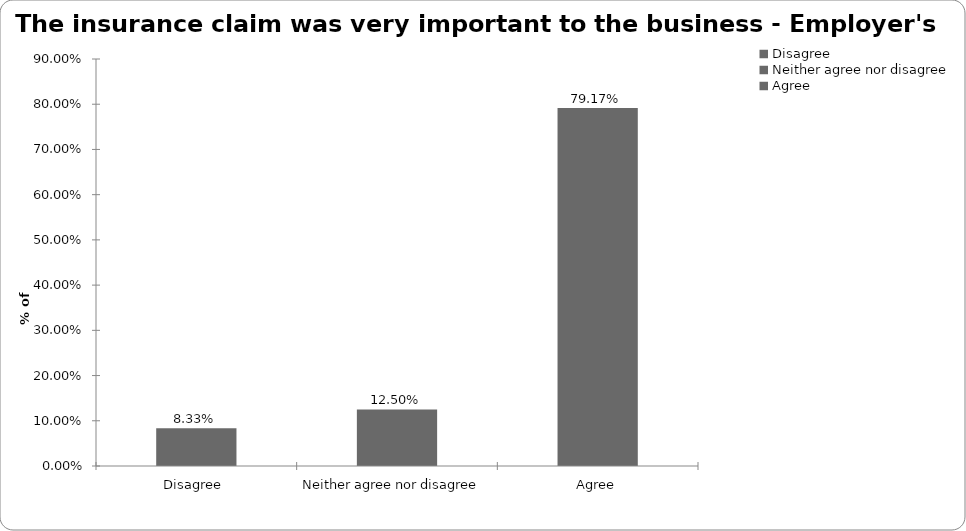
| Category | Employer's liability |
|---|---|
| Disagree  | 0.083 |
| Neither agree nor disagree  | 0.125 |
| Agree | 0.792 |